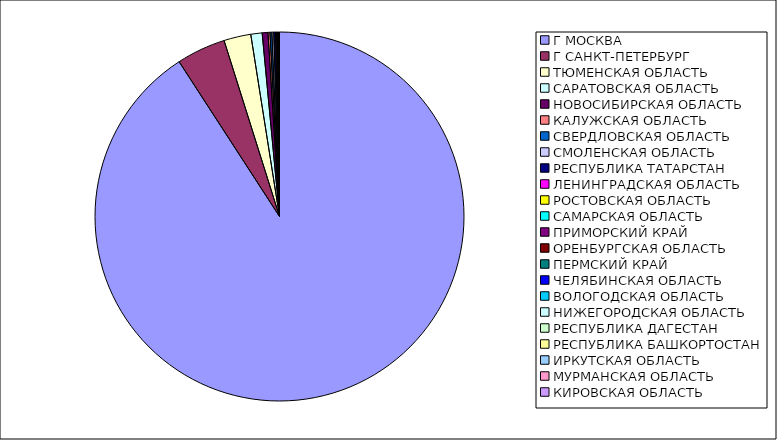
| Category | Оборот |
|---|---|
| Г МОСКВА | 0.908 |
| Г САНКТ-ПЕТЕРБУРГ | 0.043 |
| ТЮМЕНСКАЯ ОБЛАСТЬ | 0.024 |
| САРАТОВСКАЯ ОБЛАСТЬ | 0.01 |
| НОВОСИБИРСКАЯ ОБЛАСТЬ | 0.005 |
| КАЛУЖСКАЯ ОБЛАСТЬ | 0.002 |
| СВЕРДЛОВСКАЯ ОБЛАСТЬ | 0.002 |
| СМОЛЕНСКАЯ ОБЛАСТЬ | 0.002 |
| РЕСПУБЛИКА ТАТАРСТАН | 0.002 |
| ЛЕНИНГРАДСКАЯ ОБЛАСТЬ | 0.001 |
| РОСТОВСКАЯ ОБЛАСТЬ | 0 |
| САМАРСКАЯ ОБЛАСТЬ | 0 |
| ПРИМОРСКИЙ КРАЙ | 0 |
| ОРЕНБУРГСКАЯ ОБЛАСТЬ | 0 |
| ПЕРМСКИЙ КРАЙ | 0 |
| ЧЕЛЯБИНСКАЯ ОБЛАСТЬ | 0 |
| ВОЛОГОДСКАЯ ОБЛАСТЬ | 0 |
| НИЖЕГОРОДСКАЯ ОБЛАСТЬ | 0 |
| РЕСПУБЛИКА ДАГЕСТАН | 0 |
| РЕСПУБЛИКА БАШКОРТОСТАН | 0 |
| ИРКУТСКАЯ ОБЛАСТЬ | 0 |
| МУРМАНСКАЯ ОБЛАСТЬ | 0 |
| КИРОВСКАЯ ОБЛАСТЬ | 0 |